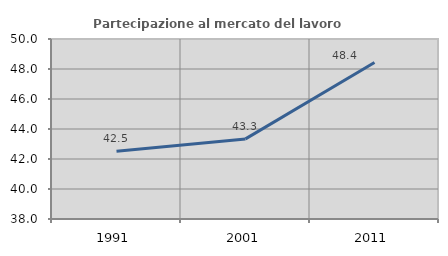
| Category | Partecipazione al mercato del lavoro  femminile |
|---|---|
| 1991.0 | 42.522 |
| 2001.0 | 43.341 |
| 2011.0 | 48.438 |